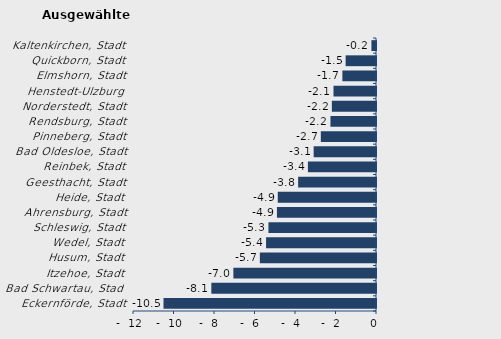
| Category | Überschuss der Geborenen (+) bzw. Gestorbenen (-) |
|---|---|
| Eckernförde, Stadt | -10.493 |
| Bad Schwartau, Stadt | -8.132 |
| Itzehoe, Stadt | -7.043 |
| Husum, Stadt | -5.735 |
| Wedel, Stadt | -5.429 |
| Schleswig, Stadt | -5.312 |
| Ahrensburg, Stadt | -4.892 |
| Heide, Stadt | -4.851 |
| Geesthacht, Stadt | -3.845 |
| Reinbek, Stadt | -3.363 |
| Bad Oldesloe, Stadt | -3.078 |
| Pinneberg, Stadt | -2.725 |
| Rendsburg, Stadt | -2.249 |
| Norderstedt, Stadt | -2.18 |
| Henstedt-Ulzburg | -2.099 |
| Elmshorn, Stadt | -1.661 |
| Quickborn, Stadt | -1.5 |
| Kaltenkirchen, Stadt | -0.226 |